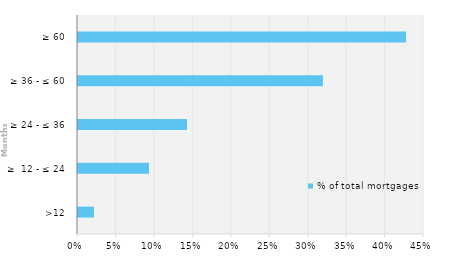
| Category | % of total mortgages |
|---|---|
| >12 | 0.021 |
| ≥  12 - ≤ 24 | 0.092 |
| ≥ 24 - ≤ 36 | 0.142 |
| ≥ 36 - ≤ 60 | 0.318 |
| ≥ 60 | 0.427 |